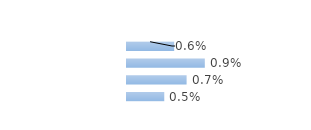
| Category | Series 0 |
|---|---|
| Modeste | 0.006 |
| Médian inférieur | 0.009 |
| Médian supérieur | 0.007 |
| Aisé | 0.004 |